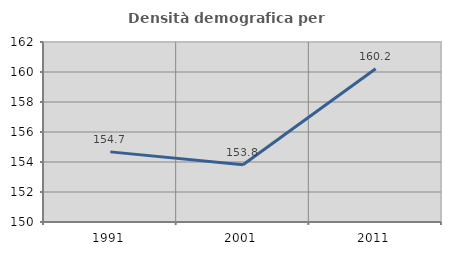
| Category | Densità demografica |
|---|---|
| 1991.0 | 154.675 |
| 2001.0 | 153.817 |
| 2011.0 | 160.221 |